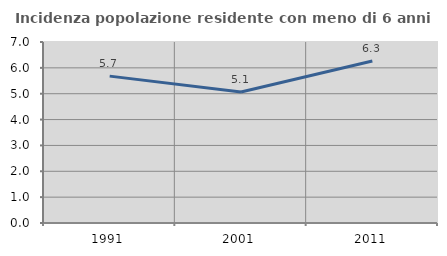
| Category | Incidenza popolazione residente con meno di 6 anni |
|---|---|
| 1991.0 | 5.68 |
| 2001.0 | 5.069 |
| 2011.0 | 6.264 |